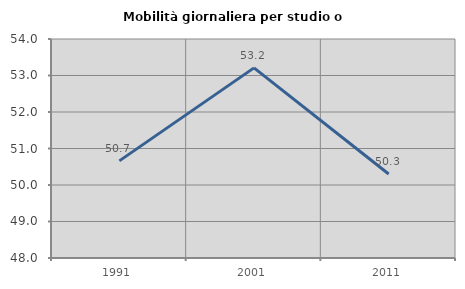
| Category | Mobilità giornaliera per studio o lavoro |
|---|---|
| 1991.0 | 50.661 |
| 2001.0 | 53.209 |
| 2011.0 | 50.301 |